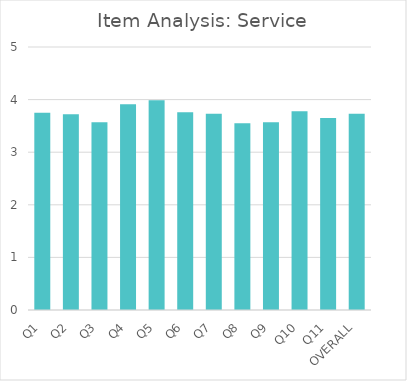
| Category | Series 0 |
|---|---|
| Q1 | 3.75 |
| Q2 | 3.72 |
| Q3 | 3.57 |
| Q4 | 3.91 |
| Q5 | 3.99 |
| Q6 | 3.76 |
| Q7 | 3.73 |
| Q8 | 3.55 |
| Q9 | 3.57 |
| Q10 | 3.78 |
| Q11 | 3.65 |
| OVERALL | 3.73 |